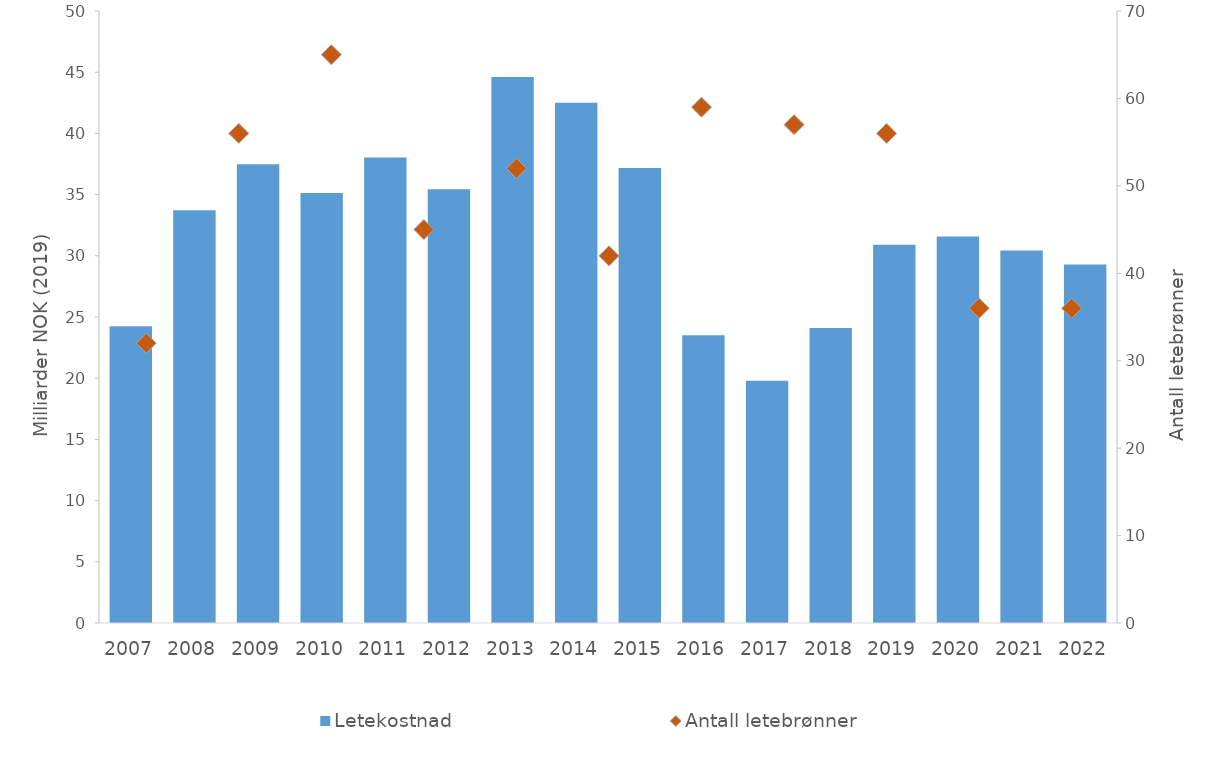
| Category | Letekostnad  |
|---|---|
| 2007.0 | 24.235 |
| 2008.0 | 33.728 |
| 2009.0 | 37.489 |
| 2010.0 | 35.134 |
| 2011.0 | 38.031 |
| 2012.0 | 35.435 |
| 2013.0 | 44.6 |
| 2014.0 | 42.495 |
| 2015.0 | 37.171 |
| 2016.0 | 23.516 |
| 2017.0 | 19.792 |
| 2018.0 | 24.101 |
| 2019.0 | 30.904 |
| 2020.0 | 31.57 |
| 2021.0 | 30.44 |
| 2022.0 | 29.284 |